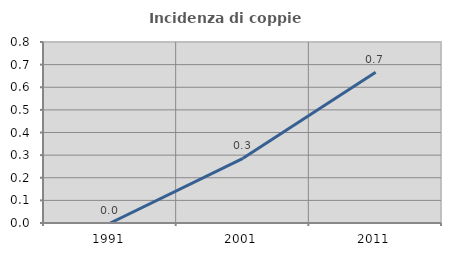
| Category | Incidenza di coppie miste |
|---|---|
| 1991.0 | 0 |
| 2001.0 | 0.286 |
| 2011.0 | 0.667 |